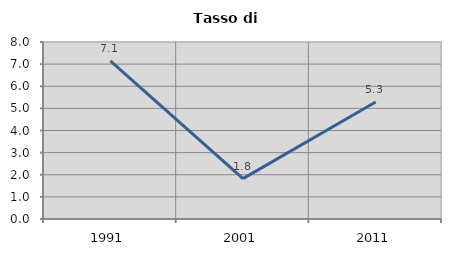
| Category | Tasso di disoccupazione   |
|---|---|
| 1991.0 | 7.143 |
| 2001.0 | 1.826 |
| 2011.0 | 5.286 |